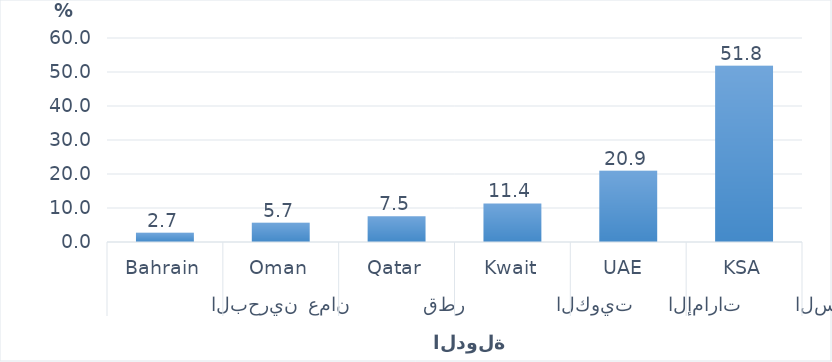
| Category | Series 0 |
|---|---|
| 0 | 51.803 |
| 1 | 20.934 |
| 2 | 11.352 |
| 3 | 7.541 |
| 4 | 5.672 |
| 5 | 2.699 |